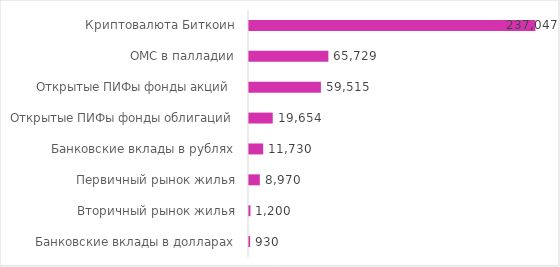
| Category | Реальная доходность, рублей |
|---|---|
| Криптовалюта Биткоин | 237047.134 |
| ОМС в палладии | 65728.886 |
| Открытые ПИФы фонды акций  | 59515.02 |
| Открытые ПИФы фонды облигаций | 19654.029 |
| Банковские вклады в рублях | 11730 |
| Первичный рынок жилья | 8970 |
| Вторичный рынок жилья | 1200 |
| Банковские вклады в долларах | 930 |